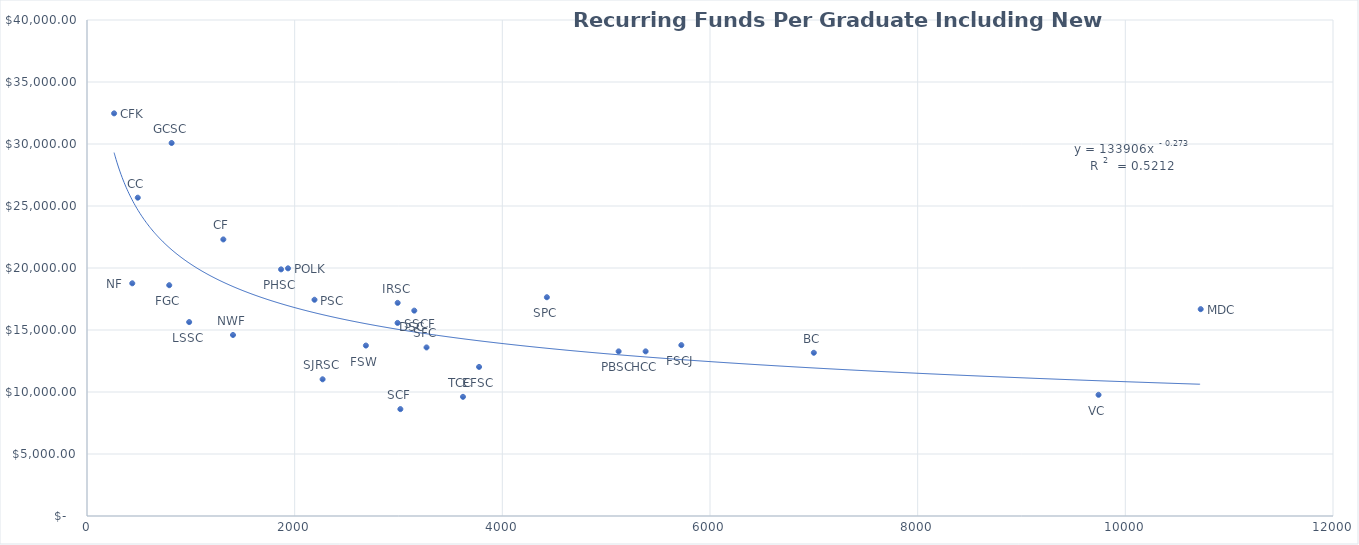
| Category |  Recurring Funds Per Graduate Including New Distributions |
|---|---|
| 491.0 | 41215.456 |
| 261.0 | 32470.716 |
| 815.0 | 30080.427 |
| 489.0 | 25670.922 |
| 1313.0 | 22303.872 |
| 1936.0 | 19972.671 |
| 1869.0 | 19889.444 |
| 436.0 | 18765.172 |
| 792.0 | 18611.658 |
| 4429.0 | 17642.105 |
| 2191.0 | 17439.127 |
| 2992.0 | 17186.822 |
| 10726.0 | 16679.652 |
| 3152.0 | 16561.318 |
| 984.0 | 15639.487 |
| 2991.0 | 15570.356 |
| 1406.0 | 14598.214 |
| 5724.0 | 13779.994 |
| 2686.0 | 13745.897 |
| 3270.0 | 13594.068 |
| 5380.0 | 13276.685 |
| 5120.0 | 13274.709 |
| 7000.0 | 13163.646 |
| 3776.0 | 12021.338 |
| 2269.0 | 11024.028 |
| 9742.0 | 9772.261 |
| 3621.0 | 9609.498 |
| 3018.0 | 8619.834 |